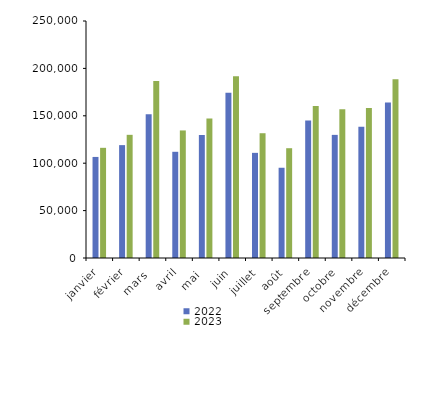
| Category | 2022 | 2023 |
|---|---|---|
| janvier | 106609 | 116222 |
| février | 119068 | 129928 |
| mars  | 151561 | 186668 |
| avril | 112035 | 134556 |
| mai  | 129772 | 147059 |
| juin | 174296 | 191589 |
| juillet | 110916 | 131618 |
| août | 95194 | 115818 |
| septembre | 145113 | 160356 |
| octobre | 129881 | 156883 |
| novembre | 138446 | 158136 |
| décembre | 164059 | 188513 |